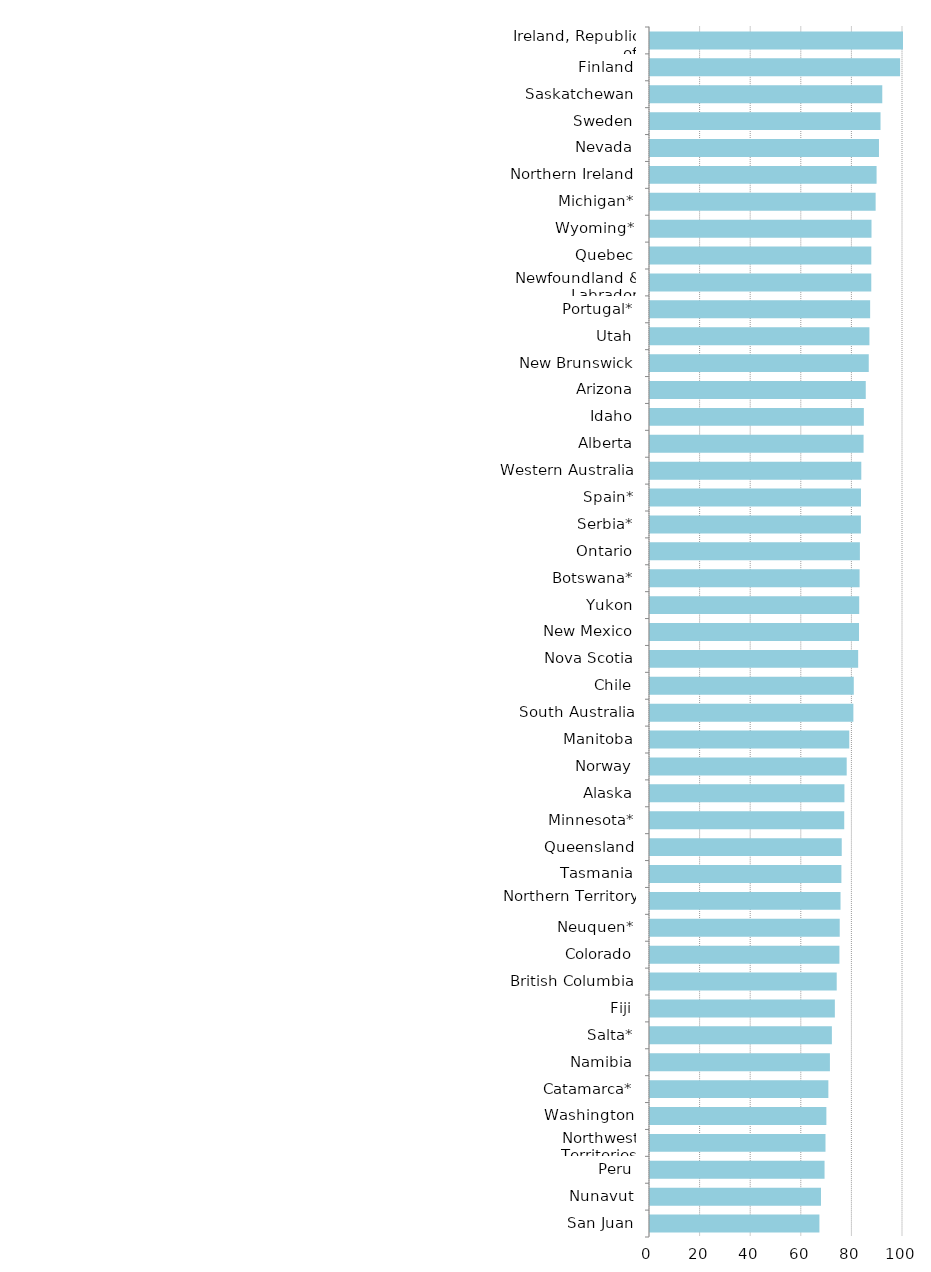
| Category | Series 0 |
|---|---|
| San Juan | 66.965 |
| Nunavut | 67.581 |
| Peru | 68.993 |
| Northwest Territories | 69.366 |
| Washington | 69.711 |
| Catamarca* | 70.498 |
| Namibia | 71.112 |
| Salta* | 71.89 |
| Fiji | 73.066 |
| British Columbia | 73.8 |
| Colorado | 74.873 |
| Neuquen* | 74.991 |
| Northern Territory | 75.305 |
| Tasmania | 75.648 |
| Queensland | 75.783 |
| Minnesota* | 76.775 |
| Alaska | 76.847 |
| Norway | 77.745 |
| Manitoba | 78.765 |
| South Australia | 80.387 |
| Chile | 80.545 |
| Nova Scotia | 82.278 |
| New Mexico | 82.614 |
| Yukon | 82.691 |
| Botswana* | 82.843 |
| Ontario | 82.961 |
| Serbia* | 83.36 |
| Spain* | 83.389 |
| Western Australia | 83.515 |
| Alberta | 84.419 |
| Idaho | 84.522 |
| Arizona | 85.282 |
| New Brunswick | 86.465 |
| Utah | 86.73 |
| Portugal* | 87.012 |
| Newfoundland & Labrador | 87.459 |
| Quebec | 87.47 |
| Wyoming* | 87.552 |
| Michigan* | 89.183 |
| Northern Ireland | 89.559 |
| Nevada | 90.503 |
| Sweden | 91.115 |
| Saskatchewan | 91.807 |
| Finland | 98.841 |
| Ireland, Republic of | 100 |